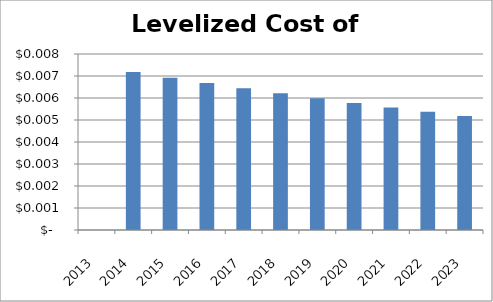
| Category | Levelized Cost of Energy |
|---|---|
| 2013.0 | 0 |
| 2014.0 | 0.007 |
| 2015.0 | 0.007 |
| 2016.0 | 0.007 |
| 2017.0 | 0.006 |
| 2018.0 | 0.006 |
| 2019.0 | 0.006 |
| 2020.0 | 0.006 |
| 2021.0 | 0.006 |
| 2022.0 | 0.005 |
| 2023.0 | 0.005 |